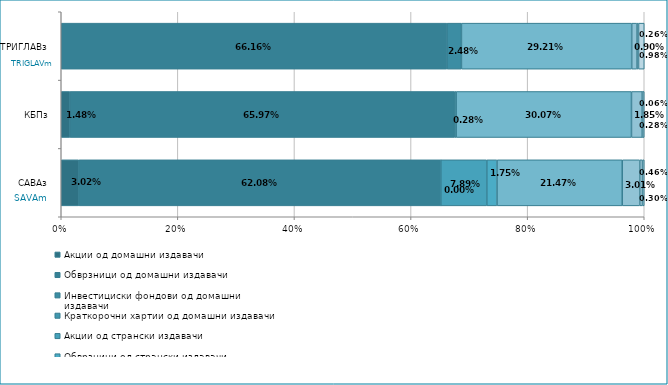
| Category | Акции од домашни издавачи  | Обврзници од домашни издавачи  | Инвестициски фондови од домашни издавачи  | Краткорочни хартии од домашни издавачи  | Акции од странски издавачи  | Обврзници од странски издавачи  | Инвестициски фондови од странски издавaчи | Краткорочни хартии од странски издавачи  | Депозити  | Парични средства  | Побарувања |
|---|---|---|---|---|---|---|---|---|---|---|---|
| САВАз | 0.03 | 0.621 | 0 | 0 | 0.079 | 0.018 | 0.215 | 0 | 0.03 | 0.005 | 0.003 |
| КБПз | 0.015 | 0.66 | 0.003 | 0 | 0 | 0 | 0.301 | 0 | 0.019 | 0.001 | 0.003 |
| ТРИГЛАВз | 0 | 0.662 | 0.025 | 0 | 0 | 0 | 0.292 | 0 | 0.009 | 0.003 | 0.01 |